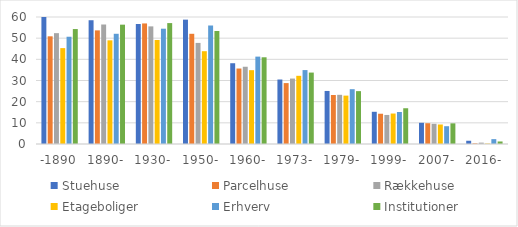
| Category | Stuehuse | Parcelhuse | Rækkehuse | Etageboliger | Erhverv | Institutioner |
|---|---|---|---|---|---|---|
| -1890 | 60.911 | 50.875 | 52.37 | 45.301 | 50.676 | 54.306 |
| 1890- | 58.473 | 53.682 | 56.457 | 48.975 | 52.073 | 56.379 |
| 1930- | 56.684 | 56.956 | 55.57 | 49.129 | 54.471 | 57.124 |
| 1950- | 58.751 | 52.068 | 47.756 | 43.844 | 55.985 | 53.384 |
| 1960- | 38.157 | 35.664 | 36.499 | 34.882 | 41.282 | 40.97 |
| 1973- | 30.463 | 28.774 | 30.918 | 32.218 | 34.921 | 33.747 |
| 1979- | 25.062 | 23.14 | 23.238 | 22.856 | 25.896 | 24.979 |
| 1999- | 15.218 | 14.297 | 13.723 | 14.397 | 15.123 | 16.893 |
| 2007- | 10.02 | 9.815 | 9.546 | 9.217 | 8.403 | 9.756 |
| 2016- | 1.533 | 0.29 | 0.652 | 0.2 | 2.297 | 1.194 |